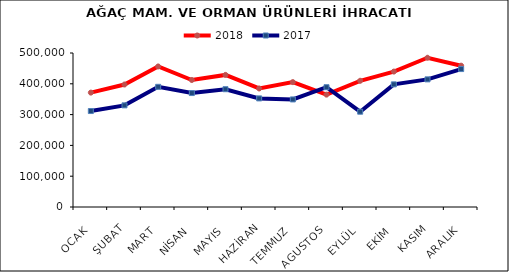
| Category | 2018 | 2017 |
|---|---|---|
| OCAK | 371396.82 | 311572.28 |
| ŞUBAT | 397684.049 | 330041.249 |
| MART | 456328.599 | 390176.608 |
| NİSAN | 412348.273 | 369971.816 |
| MAYIS | 428899.539 | 382423.313 |
| HAZİRAN | 384816.25 | 352619.871 |
| TEMMUZ | 405455.249 | 349275.817 |
| AGUSTOS | 364812.25 | 388922.449 |
| EYLÜL | 409811.614 | 309451.012 |
| EKİM | 439696.526 | 398179.52 |
| KASIM | 484574.659 | 414375.117 |
| ARALIK | 458789.155 | 447824.803 |